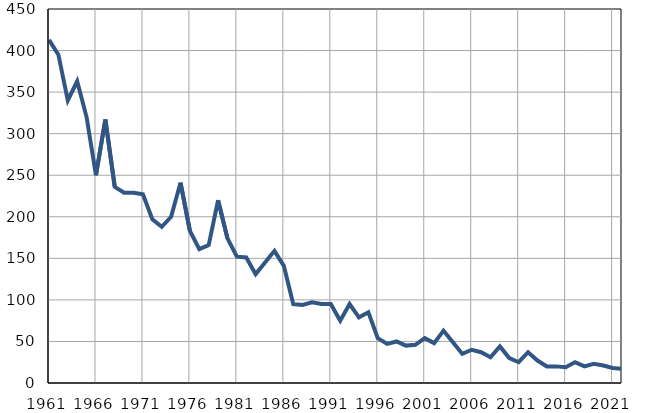
| Category | Умрла 
одојчад |
|---|---|
| 1961.0 | 413 |
| 1962.0 | 395 |
| 1963.0 | 340 |
| 1964.0 | 363 |
| 1965.0 | 320 |
| 1966.0 | 250 |
| 1967.0 | 317 |
| 1968.0 | 236 |
| 1969.0 | 229 |
| 1970.0 | 229 |
| 1971.0 | 227 |
| 1972.0 | 197 |
| 1973.0 | 188 |
| 1974.0 | 200 |
| 1975.0 | 241 |
| 1976.0 | 183 |
| 1977.0 | 161 |
| 1978.0 | 166 |
| 1979.0 | 220 |
| 1980.0 | 174 |
| 1981.0 | 152 |
| 1982.0 | 151 |
| 1983.0 | 131 |
| 1984.0 | 145 |
| 1985.0 | 159 |
| 1986.0 | 141 |
| 1987.0 | 95 |
| 1988.0 | 94 |
| 1989.0 | 97 |
| 1990.0 | 95 |
| 1991.0 | 95 |
| 1992.0 | 75 |
| 1993.0 | 95 |
| 1994.0 | 79 |
| 1995.0 | 85 |
| 1996.0 | 54 |
| 1997.0 | 47 |
| 1998.0 | 50 |
| 1999.0 | 45 |
| 2000.0 | 46 |
| 2001.0 | 54 |
| 2002.0 | 48 |
| 2003.0 | 63 |
| 2004.0 | 49 |
| 2005.0 | 35 |
| 2006.0 | 40 |
| 2007.0 | 37 |
| 2008.0 | 31 |
| 2009.0 | 44 |
| 2010.0 | 30 |
| 2011.0 | 25 |
| 2012.0 | 37 |
| 2013.0 | 27 |
| 2014.0 | 20 |
| 2015.0 | 20 |
| 2016.0 | 19 |
| 2017.0 | 25 |
| 2018.0 | 20 |
| 2019.0 | 23 |
| 2020.0 | 21 |
| 2021.0 | 18 |
| 2022.0 | 17 |